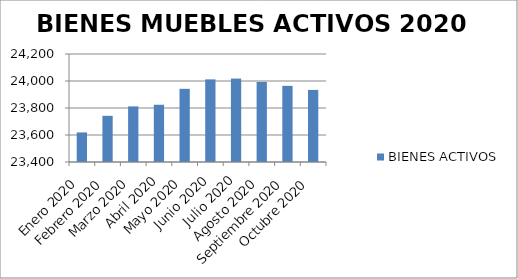
| Category | BIENES ACTIVOS |
|---|---|
| Enero 2020 | 23619 |
| Febrero 2020 | 23742 |
| Marzo 2020 | 23812 |
| Abril 2020 | 23824 |
| Mayo 2020 | 23942 |
| Junio 2020 | 24012 |
| Julio 2020 | 24018 |
| Agosto 2020 | 23993 |
| Septiembre 2020 | 23964 |
| Octubre 2020 | 23934 |